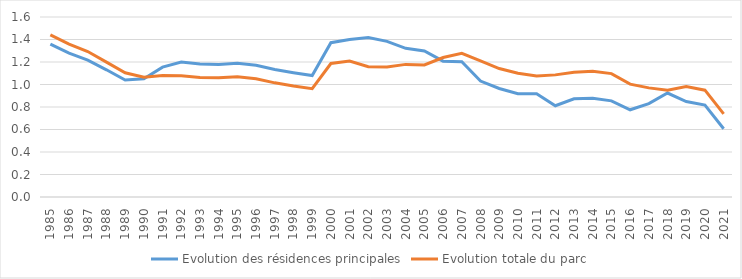
| Category | Evolution des résidences principales | Evolution totale du parc |
|---|---|---|
| 1985.0 | 1.359 | 1.441 |
| 1986.0 | 1.278 | 1.359 |
| 1987.0 | 1.217 | 1.293 |
| 1988.0 | 1.131 | 1.199 |
| 1989.0 | 1.039 | 1.104 |
| 1990.0 | 1.05 | 1.065 |
| 1991.0 | 1.154 | 1.079 |
| 1992.0 | 1.199 | 1.078 |
| 1993.0 | 1.183 | 1.063 |
| 1994.0 | 1.177 | 1.059 |
| 1995.0 | 1.188 | 1.07 |
| 1996.0 | 1.171 | 1.052 |
| 1997.0 | 1.134 | 1.015 |
| 1998.0 | 1.105 | 0.987 |
| 1999.0 | 1.08 | 0.963 |
| 2000.0 | 1.372 | 1.187 |
| 2001.0 | 1.4 | 1.209 |
| 2002.0 | 1.417 | 1.158 |
| 2003.0 | 1.383 | 1.157 |
| 2004.0 | 1.322 | 1.179 |
| 2005.0 | 1.298 | 1.174 |
| 2006.0 | 1.208 | 1.24 |
| 2007.0 | 1.203 | 1.276 |
| 2008.0 | 1.031 | 1.211 |
| 2009.0 | 0.965 | 1.142 |
| 2010.0 | 0.917 | 1.099 |
| 2011.0 | 0.918 | 1.076 |
| 2012.0 | 0.811 | 1.086 |
| 2013.0 | 0.874 | 1.109 |
| 2014.0 | 0.877 | 1.119 |
| 2015.0 | 0.855 | 1.097 |
| 2016.0 | 0.775 | 1.003 |
| 2017.0 | 0.831 | 0.97 |
| 2018.0 | 0.924 | 0.95 |
| 2019.0 | 0.849 | 0.981 |
| 2020.0 | 0.817 | 0.95 |
| 2021.0 | 0.607 | 0.739 |